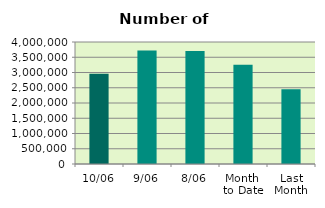
| Category | Series 0 |
|---|---|
| 10/06 | 2956480 |
| 9/06 | 3720866 |
| 8/06 | 3702954 |
| Month 
to Date | 3250744 |
| Last
Month | 2451339.2 |